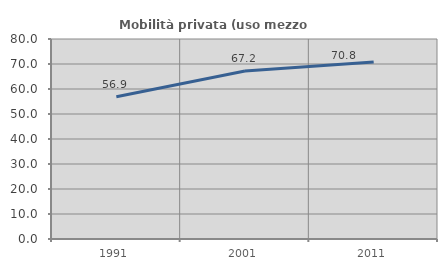
| Category | Mobilità privata (uso mezzo privato) |
|---|---|
| 1991.0 | 56.931 |
| 2001.0 | 67.17 |
| 2011.0 | 70.79 |